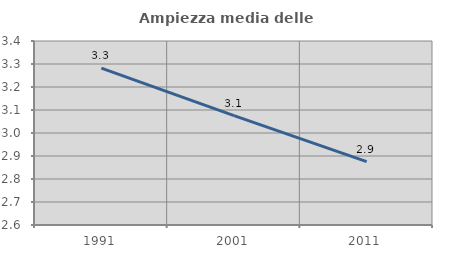
| Category | Ampiezza media delle famiglie |
|---|---|
| 1991.0 | 3.282 |
| 2001.0 | 3.076 |
| 2011.0 | 2.875 |